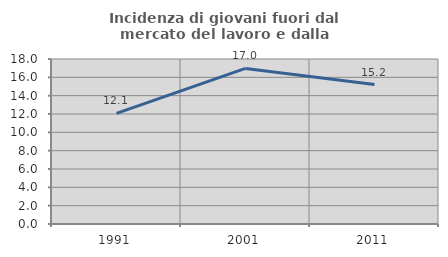
| Category | Incidenza di giovani fuori dal mercato del lavoro e dalla formazione  |
|---|---|
| 1991.0 | 12.066 |
| 2001.0 | 16.972 |
| 2011.0 | 15.212 |